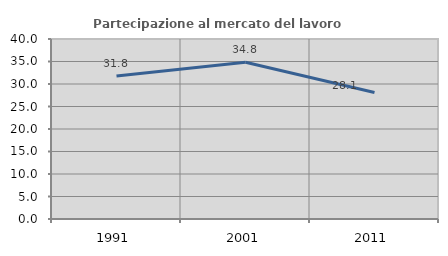
| Category | Partecipazione al mercato del lavoro  femminile |
|---|---|
| 1991.0 | 31.79 |
| 2001.0 | 34.828 |
| 2011.0 | 28.102 |